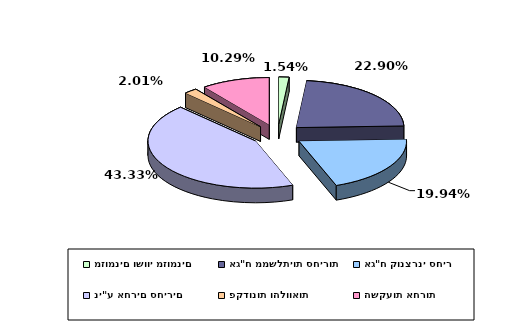
| Category | Series 0 |
|---|---|
| מזומנים ושווי מזומנים | 0.015 |
| אג"ח ממשלתיות סחירות | 0.229 |
| אג"ח קונצרני סחיר | 0.199 |
| ני"ע אחרים סחירים | 0.433 |
| פקדונות והלוואות | 0.02 |
| השקעות אחרות | 0.103 |